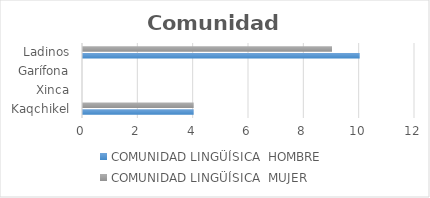
| Category | COMUNIDAD LINGÜÍSICA  |
|---|---|
| Kaqchikel | 4 |
| Xinca | 0 |
| Garífona | 0 |
| Ladinos | 9 |